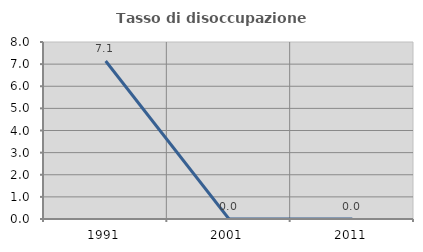
| Category | Tasso di disoccupazione giovanile  |
|---|---|
| 1991.0 | 7.143 |
| 2001.0 | 0 |
| 2011.0 | 0 |